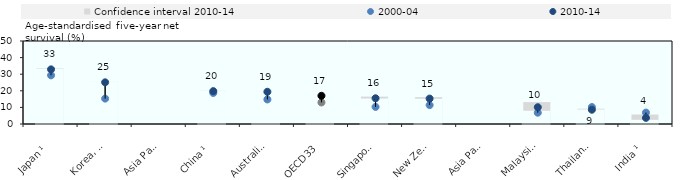
| Category | Confidence interval 2010-14 | Lower band |
|---|---|---|
| Japan ¹ | 33.4 | 32.3 |
| Korea, Rep.  | 25.4 | 24.8 |
| Asia Pacific-H | 22.28 | 20.98 |
| China ¹ | 20.2 | 19.4 |
| Australia  | 19.9 | 19 |
| OECD33 | 17.9 | 17.539 |
| Singapore  | 16.5 | 14.5 |
| New Zealand  | 16.2 | 14.3 |
| Asia Pacific-UM | 14.2 | 11.467 |
| Malaysia ¹ | 13.2 | 7.1 |
| Thailand ¹ ² | 9.2 | 7.9 |
| India ¹ | 5.7 | 1.6 |